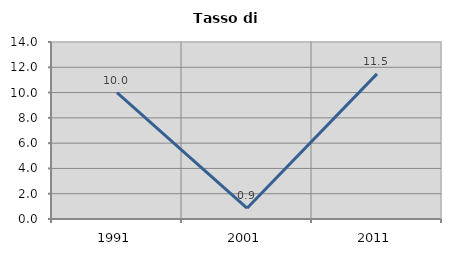
| Category | Tasso di disoccupazione   |
|---|---|
| 1991.0 | 10 |
| 2001.0 | 0.855 |
| 2011.0 | 11.475 |